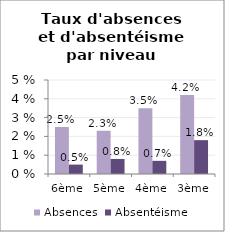
| Category | Absences | Absentéisme |
|---|---|---|
| 6ème | 2.5 | 0.5 |
| 5ème | 2.3 | 0.8 |
| 4ème | 3.5 | 0.7 |
| 3ème | 4.2 | 1.8 |